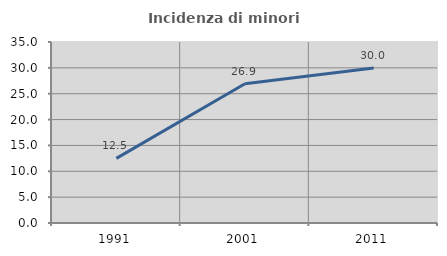
| Category | Incidenza di minori stranieri |
|---|---|
| 1991.0 | 12.5 |
| 2001.0 | 26.923 |
| 2011.0 | 29.982 |